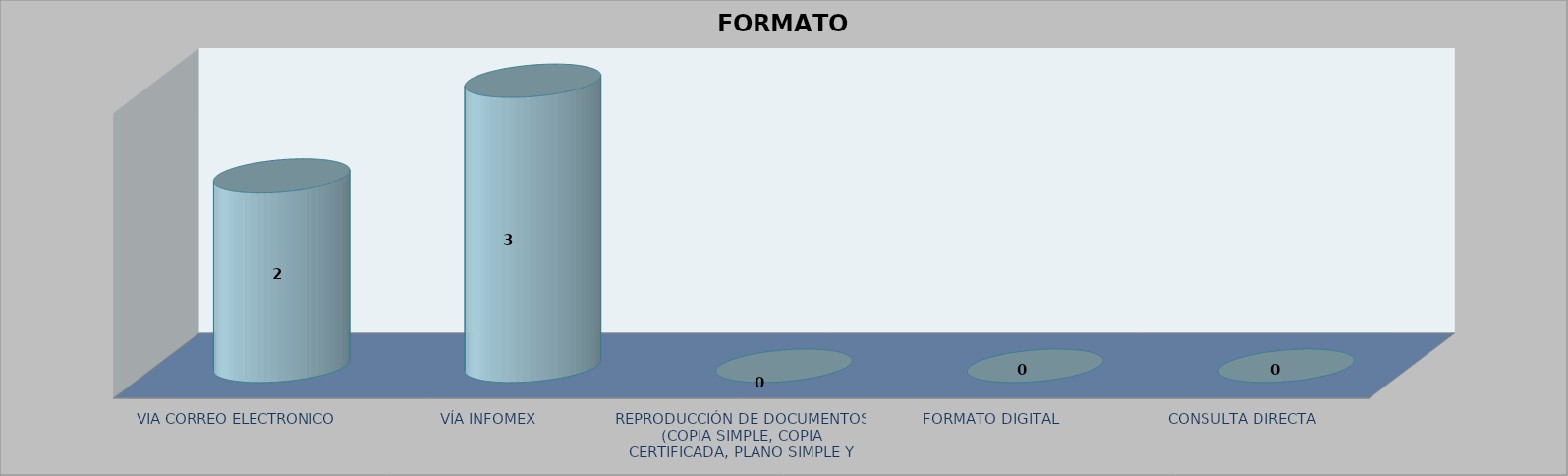
| Category |        FORMATO SOLICITADO | Series 1 | Series 2 |
|---|---|---|---|
| VIA CORREO ELECTRONICO |  |  | 2 |
| VÍA INFOMEX |  |  | 3 |
| REPRODUCCIÓN DE DOCUMENTOS (COPIA SIMPLE, COPIA CERTIFICADA, PLANO SIMPLE Y PLANO CERTIFICADO) |  |  | 0 |
| FORMATO DIGITAL |  |  | 0 |
| CONSULTA DIRECTA |  |  | 0 |